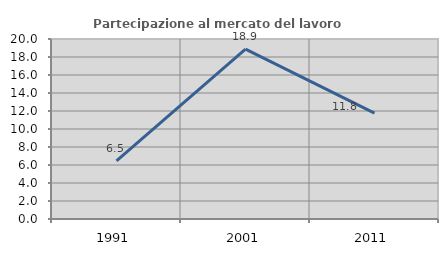
| Category | Partecipazione al mercato del lavoro  femminile |
|---|---|
| 1991.0 | 6.452 |
| 2001.0 | 18.868 |
| 2011.0 | 11.765 |